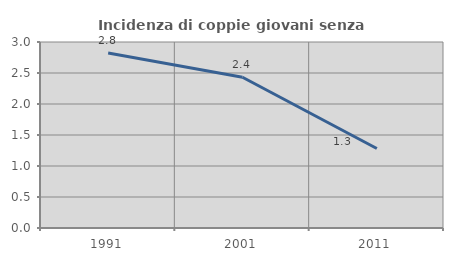
| Category | Incidenza di coppie giovani senza figli |
|---|---|
| 1991.0 | 2.821 |
| 2001.0 | 2.432 |
| 2011.0 | 1.282 |